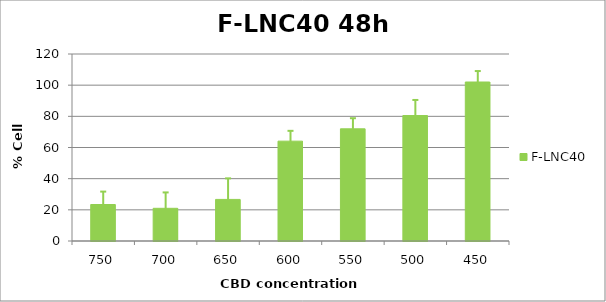
| Category | F-LNC40 |
|---|---|
| 750.0 | 23.415 |
| 700.0 | 20.982 |
| 650.0 | 26.686 |
| 600.0 | 64.08 |
| 550.0 | 71.984 |
| 500.0 | 80.511 |
| 450.0 | 102.032 |